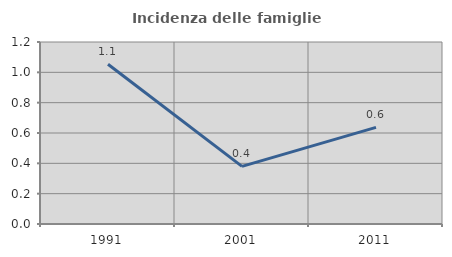
| Category | Incidenza delle famiglie numerose |
|---|---|
| 1991.0 | 1.053 |
| 2001.0 | 0.38 |
| 2011.0 | 0.637 |